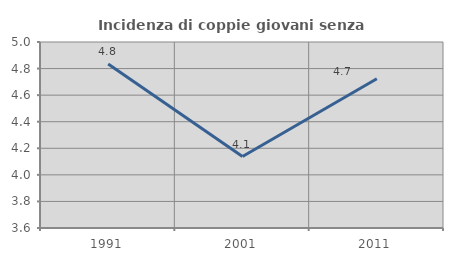
| Category | Incidenza di coppie giovani senza figli |
|---|---|
| 1991.0 | 4.835 |
| 2001.0 | 4.138 |
| 2011.0 | 4.723 |